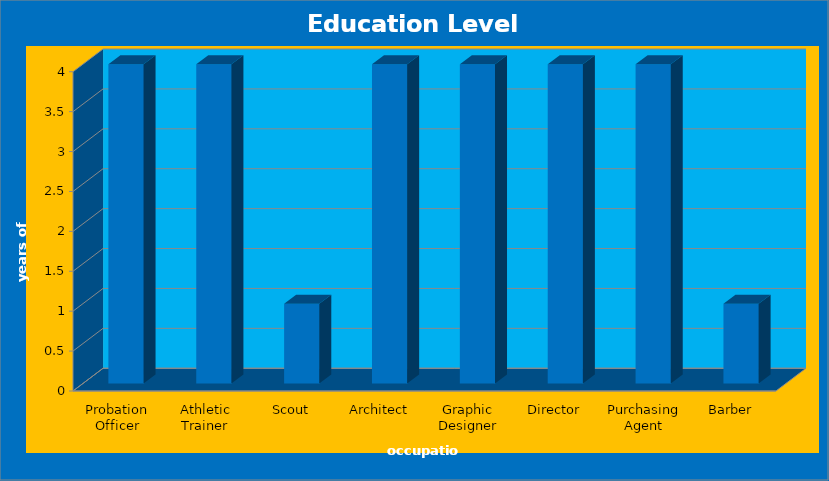
| Category | Education Level Needed No. of years after H.S. |
|---|---|
| Probation Officer | 4 |
| Athletic Trainer | 4 |
| Scout | 1 |
| Architect | 4 |
| Graphic Designer | 4 |
| Director | 4 |
| Purchasing Agent | 4 |
| Barber | 1 |